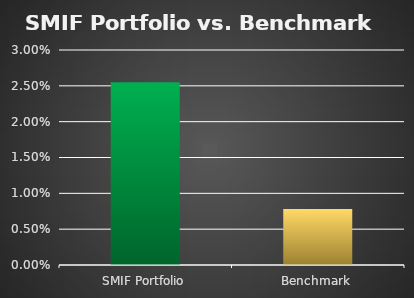
| Category | Series 0 |
|---|---|
| SMIF Portfolio | 0.026 |
| Benchmark | 0.008 |